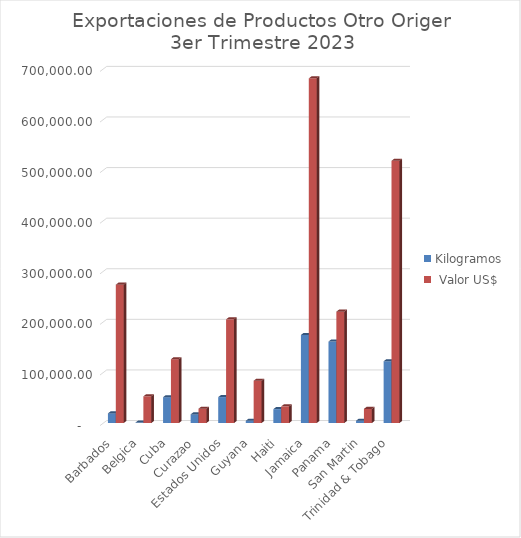
| Category | Kilogramos |  Valor US$ |
|---|---|---|
| Barbados | 19047.94 | 273536.17 |
| Belgica | 1000 | 52805.31 |
| Cuba | 51076.08 | 126132 |
| Curazao | 17079.86 | 28310.86 |
| Estados Unidos | 51256.26 | 204942.12 |
| Guyana | 4492.8 | 83662.55 |
| Haiti | 27483.32 | 32939.72 |
| Jamaica | 174071.04 | 681248.45 |
| Panama | 161103.49 | 220162.72 |
| San Martin | 4591.97 | 27918 |
| Trinidad & Tobago | 122124.9 | 518358.79 |